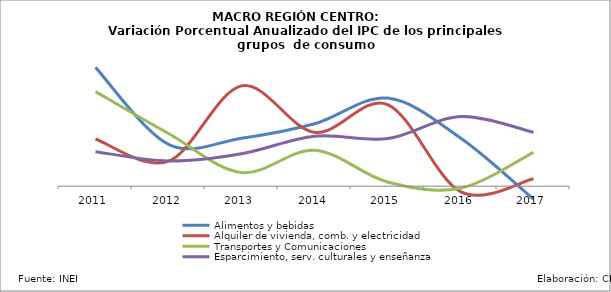
| Category | Alimentos y bebidas | Alquiler de vivienda, comb. y electricidad | Transportes y Comunicaciones | Esparcimiento, serv. culturales y enseñanza |
|---|---|---|---|---|
| 2011.0 | 0.077 | 0.031 | 0.061 | 0.022 |
| 2012.0 | 0.027 | 0.016 | 0.034 | 0.016 |
| 2013.0 | 0.031 | 0.065 | 0.009 | 0.021 |
| 2014.0 | 0.04 | 0.035 | 0.023 | 0.032 |
| 2015.0 | 0.057 | 0.053 | 0.003 | 0.031 |
| 2016.0 | 0.031 | -0.004 | -0.001 | 0.045 |
| 2017.0 | -0.008 | 0.005 | 0.022 | 0.035 |